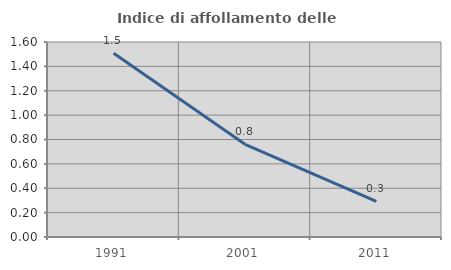
| Category | Indice di affollamento delle abitazioni  |
|---|---|
| 1991.0 | 1.508 |
| 2001.0 | 0.76 |
| 2011.0 | 0.292 |